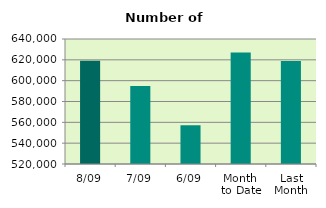
| Category | Series 0 |
|---|---|
| 8/09 | 619008 |
| 7/09 | 594990 |
| 6/09 | 557188 |
| Month 
to Date | 627028.667 |
| Last
Month | 618945.565 |